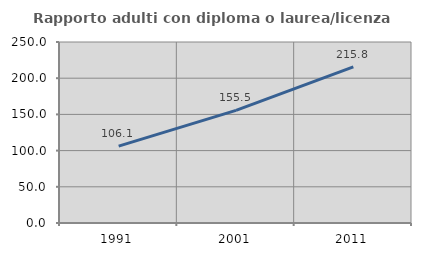
| Category | Rapporto adulti con diploma o laurea/licenza media  |
|---|---|
| 1991.0 | 106.13 |
| 2001.0 | 155.479 |
| 2011.0 | 215.77 |